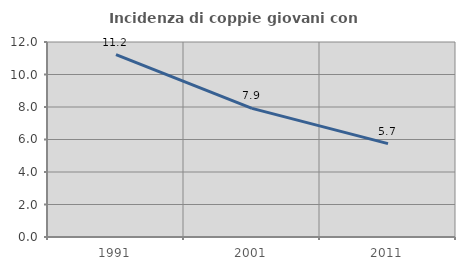
| Category | Incidenza di coppie giovani con figli |
|---|---|
| 1991.0 | 11.22 |
| 2001.0 | 7.918 |
| 2011.0 | 5.748 |